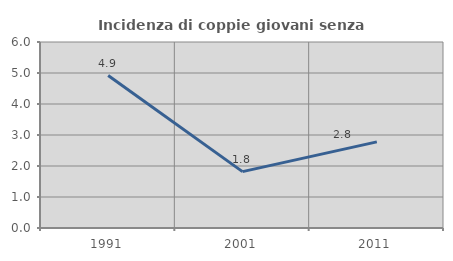
| Category | Incidenza di coppie giovani senza figli |
|---|---|
| 1991.0 | 4.918 |
| 2001.0 | 1.818 |
| 2011.0 | 2.778 |